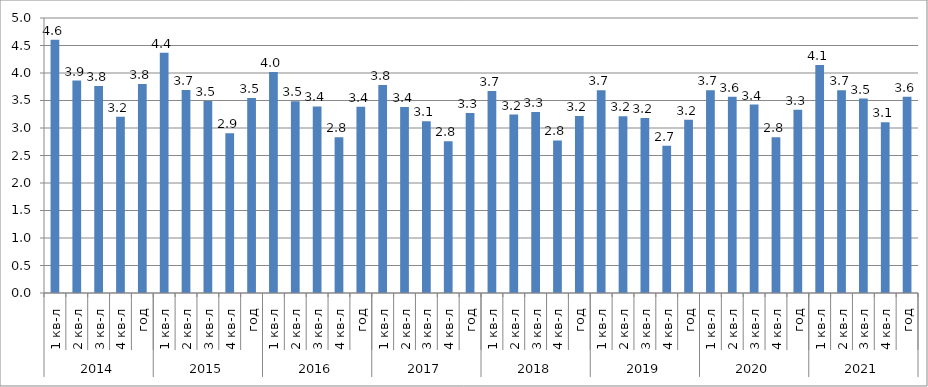
| Category | Series 0 |
|---|---|
| 0 | 4.604 |
| 1 | 3.863 |
| 2 | 3.762 |
| 3 | 3.202 |
| 4 | 3.8 |
| 5 | 4.366 |
| 6 | 3.689 |
| 7 | 3.49 |
| 8 | 2.906 |
| 9 | 3.546 |
| 10 | 4.018 |
| 11 | 3.484 |
| 12 | 3.393 |
| 13 | 2.831 |
| 14 | 3.386 |
| 15 | 3.783 |
| 16 | 3.38 |
| 17 | 3.125 |
| 18 | 2.761 |
| 19 | 3.274 |
| 20 | 3.673 |
| 21 | 3.244 |
| 22 | 3.291 |
| 23 | 2.774 |
| 24 | 3.218 |
| 25 | 3.688 |
| 26 | 3.216 |
| 27 | 3.18 |
| 28 | 2.676 |
| 29 | 3.15 |
| 30 | 3.687 |
| 31 | 3.568 |
| 32 | 3.427 |
| 33 | 2.834 |
| 34 | 3.332 |
| 35 | 4.147 |
| 36 | 3.685 |
| 37 | 3.536 |
| 38 | 3.102 |
| 39 | 3.567 |